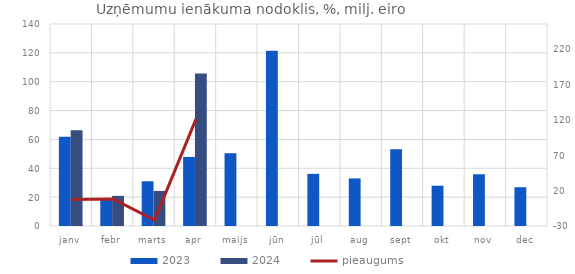
| Category | 2023 | 2024 |
|---|---|---|
| janv | 61.791 | 66.341 |
| febr | 19.323 | 20.888 |
| marts | 31.008 | 24.281 |
| apr | 47.876 | 105.696 |
| maijs | 50.345 | 0 |
| jūn | 121.503 | 0 |
| jūl | 36.144 | 0 |
| aug | 32.976 | 0 |
| sept | 53.222 | 0 |
| okt | 27.91 | 0 |
| nov | 35.855 | 0 |
| dec | 26.857 | 0 |